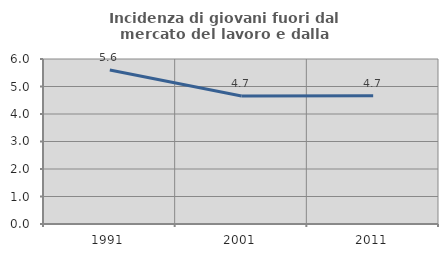
| Category | Incidenza di giovani fuori dal mercato del lavoro e dalla formazione  |
|---|---|
| 1991.0 | 5.6 |
| 2001.0 | 4.658 |
| 2011.0 | 4.659 |